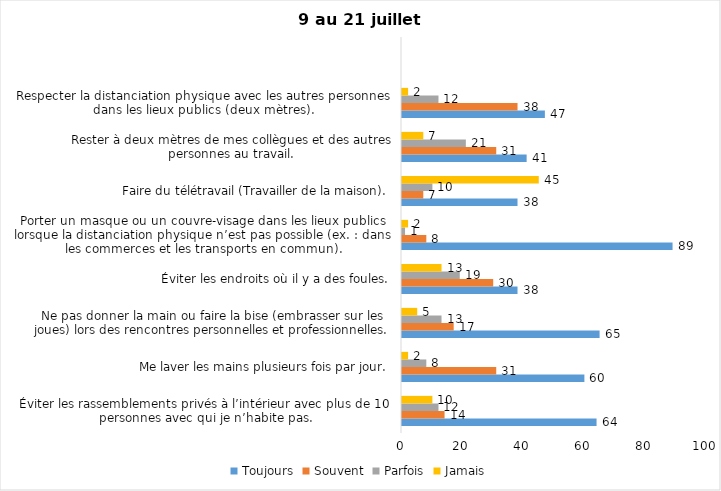
| Category | Toujours | Souvent | Parfois | Jamais |
|---|---|---|---|---|
| Éviter les rassemblements privés à l’intérieur avec plus de 10 personnes avec qui je n’habite pas. | 64 | 14 | 12 | 10 |
| Me laver les mains plusieurs fois par jour. | 60 | 31 | 8 | 2 |
| Ne pas donner la main ou faire la bise (embrasser sur les joues) lors des rencontres personnelles et professionnelles. | 65 | 17 | 13 | 5 |
| Éviter les endroits où il y a des foules. | 38 | 30 | 19 | 13 |
| Porter un masque ou un couvre-visage dans les lieux publics lorsque la distanciation physique n’est pas possible (ex. : dans les commerces et les transports en commun). | 89 | 8 | 1 | 2 |
| Faire du télétravail (Travailler de la maison). | 38 | 7 | 10 | 45 |
| Rester à deux mètres de mes collègues et des autres personnes au travail. | 41 | 31 | 21 | 7 |
| Respecter la distanciation physique avec les autres personnes dans les lieux publics (deux mètres). | 47 | 38 | 12 | 2 |